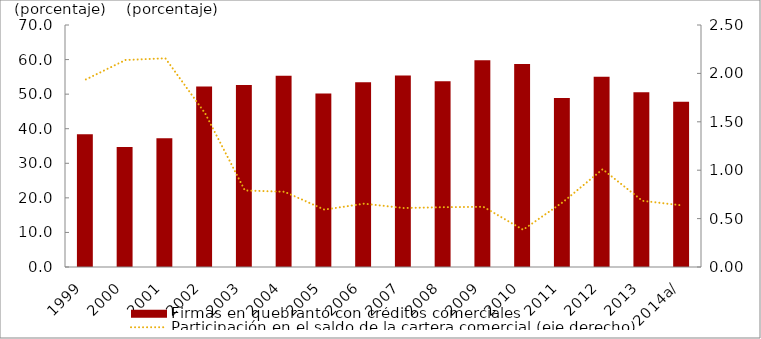
| Category | Firmas en quebranto con créditos comerciales |
|---|---|
| 1999 | 38.391 |
| 2000 | 34.733 |
| 2001 | 37.209 |
| 2002 | 52.205 |
| 2003 | 52.662 |
| 2004 | 55.31 |
| 2005 | 50.214 |
| 2006 | 53.413 |
| 2007 | 55.357 |
| 2008 | 53.739 |
| 2009 | 59.776 |
| 2010 | 58.728 |
| 2011 | 48.891 |
| 2012 | 55.056 |
| 2013 | 50.561 |
| 2014a/ | 47.808 |